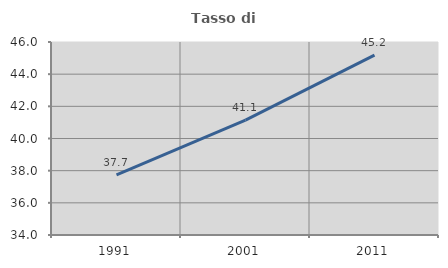
| Category | Tasso di occupazione   |
|---|---|
| 1991.0 | 37.743 |
| 2001.0 | 41.139 |
| 2011.0 | 45.188 |